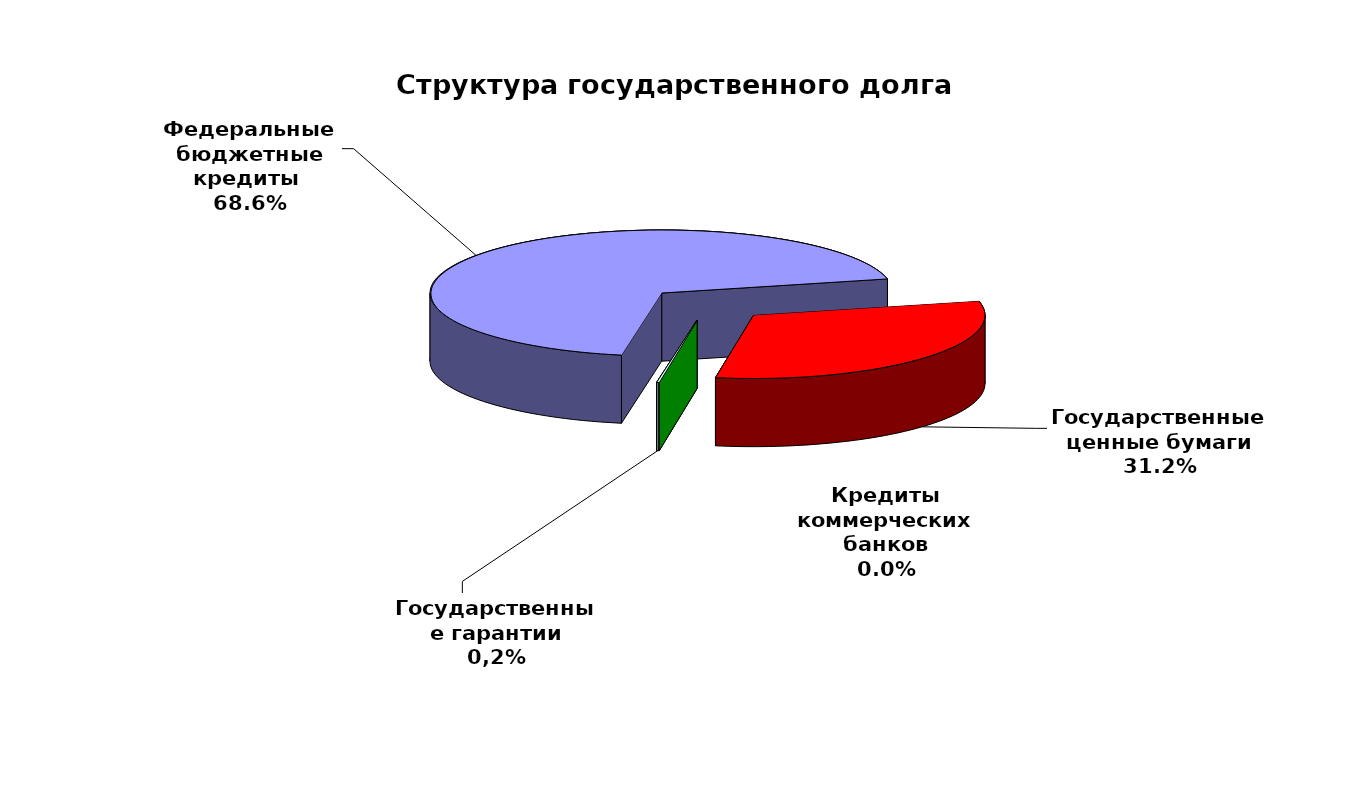
| Category | Series 0 |
|---|---|
| Федеральные бюджетные кредиты  | 91246617.843 |
| Государственные ценные бумаги | 41500000 |
| Кредиты коммерческих банков | 0 |
| Государственные гарантии | 218110.763 |